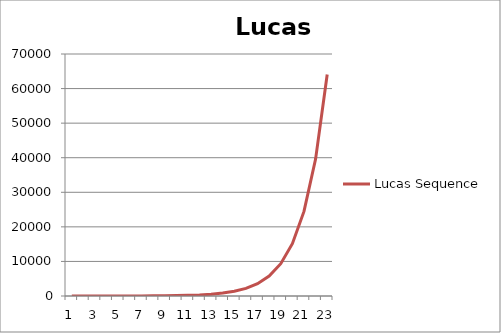
| Category | Lucas Sequence |
|---|---|
| 0 | 1 |
| 1 | 3 |
| 2 | 4 |
| 3 | 7 |
| 4 | 11 |
| 5 | 18 |
| 6 | 29 |
| 7 | 47 |
| 8 | 76 |
| 9 | 123 |
| 10 | 199 |
| 11 | 322 |
| 12 | 521 |
| 13 | 843 |
| 14 | 1364 |
| 15 | 2207 |
| 16 | 3571 |
| 17 | 5778 |
| 18 | 9349 |
| 19 | 15127 |
| 20 | 24476 |
| 21 | 39603 |
| 22 | 64079 |